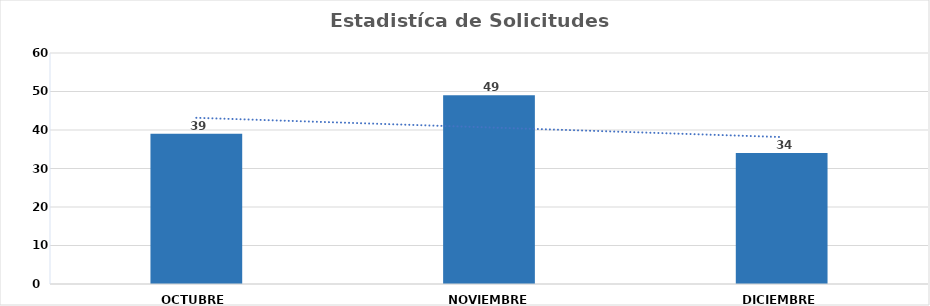
| Category | Series 0 |
|---|---|
| OCTUBRE  | 39 |
| NOVIEMBRE  | 49 |
| DICIEMBRE  | 34 |